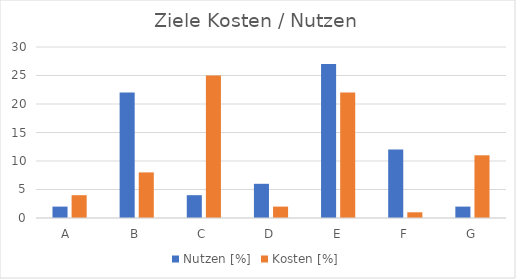
| Category | A  | B | C | D | E | F | G |
|---|---|---|---|---|---|---|---|
| Nutzen [%] | 2 | 22 | 4 | 6 | 27 | 12 | 2 |
| Kosten [%] | 4 | 8 | 25 | 2 | 22 | 1 | 11 |